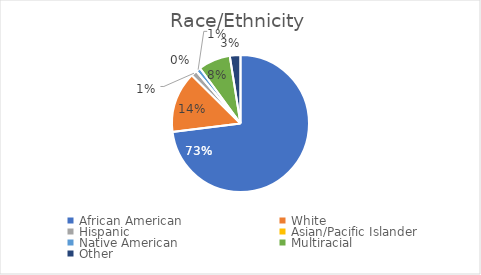
| Category | Series 0 |
|---|---|
| African American | 203 |
| White | 40 |
| Hispanic | 4 |
| Asian/Pacific Islander | 0 |
| Native American | 3 |
| Multiracial | 21 |
| Other | 7 |